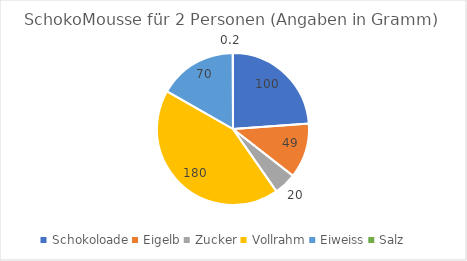
| Category | Series 0 |
|---|---|
| Schokoloade | 100 |
| Eigelb | 49 |
| Zucker | 20 |
| Vollrahm | 180 |
| Eiweiss | 70 |
| Salz | 0.2 |